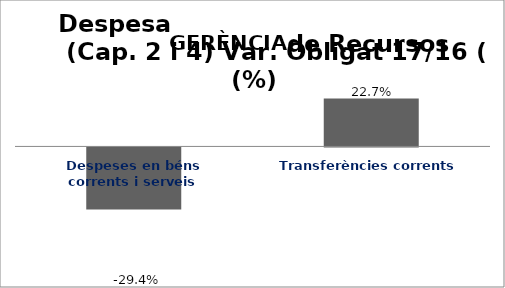
| Category | Series 0 |
|---|---|
| Despeses en béns corrents i serveis | -0.294 |
| Transferències corrents | 0.227 |